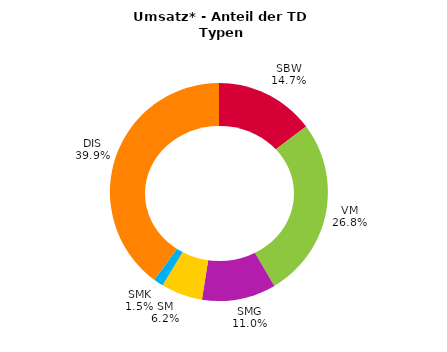
| Category | Series 0 |
|---|---|
| SBW | 0.147 |
| VM | 0.268 |
| SMG | 0.11 |
| SM | 0.062 |
| SMK | 0.015 |
| DIS | 0.399 |